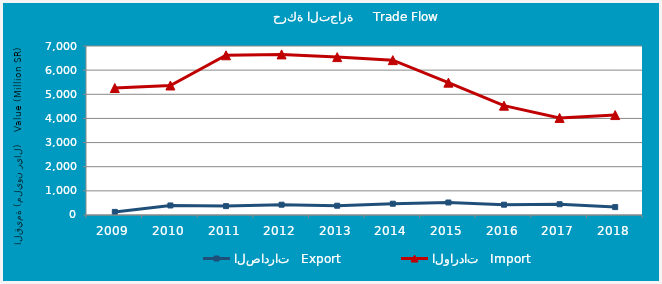
| Category | الصادرات   Export | الواردات   Import |
|---|---|---|
| 2009.0 | 128349818 | 5260864154 |
| 2010.0 | 395137704 | 5364956127 |
| 2011.0 | 368854503 | 6615423795 |
| 2012.0 | 426309212 | 6652091046 |
| 2013.0 | 384368720 | 6540059178 |
| 2014.0 | 467042438 | 6414786538 |
| 2015.0 | 517156907 | 5481468965 |
| 2016.0 | 426690469 | 4528798752 |
| 2017.0 | 445726989 | 4021328281 |
| 2018.0 | 326680172 | 4138815739 |